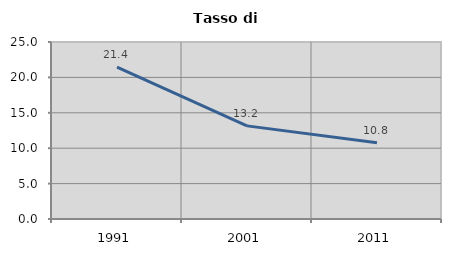
| Category | Tasso di disoccupazione   |
|---|---|
| 1991.0 | 21.437 |
| 2001.0 | 13.153 |
| 2011.0 | 10.77 |